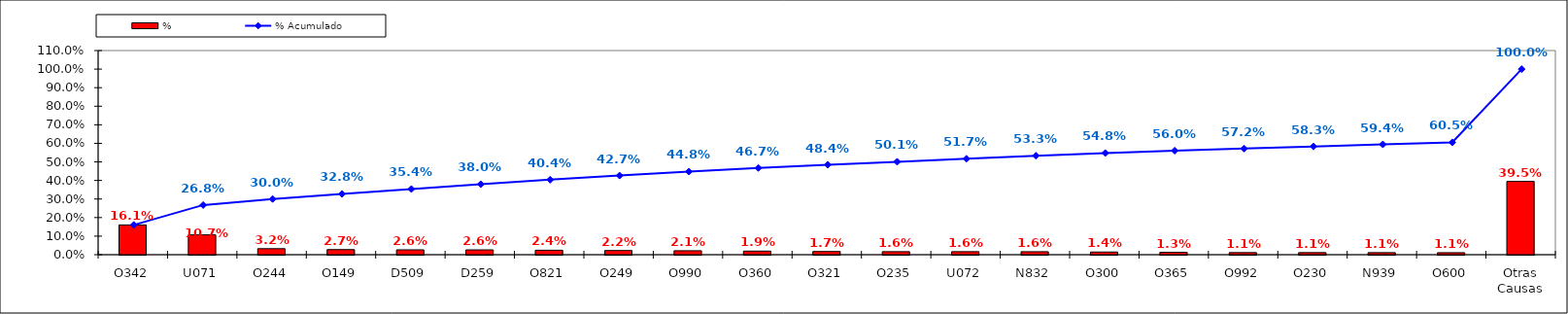
| Category | % |
|---|---|
| O342 | 0.161 |
| U071 | 0.107 |
| O244 | 0.032 |
| O149 | 0.027 |
| D509 | 0.026 |
| D259 | 0.026 |
| O821 | 0.024 |
| O249 | 0.022 |
| O990 | 0.021 |
| O360 | 0.019 |
| O321 | 0.017 |
| O235 | 0.016 |
| U072 | 0.016 |
| N832 | 0.016 |
| O300 | 0.014 |
| O365 | 0.013 |
| O992 | 0.011 |
| O230 | 0.011 |
| N939 | 0.011 |
| O600 | 0.011 |
| Otras Causas | 0.395 |